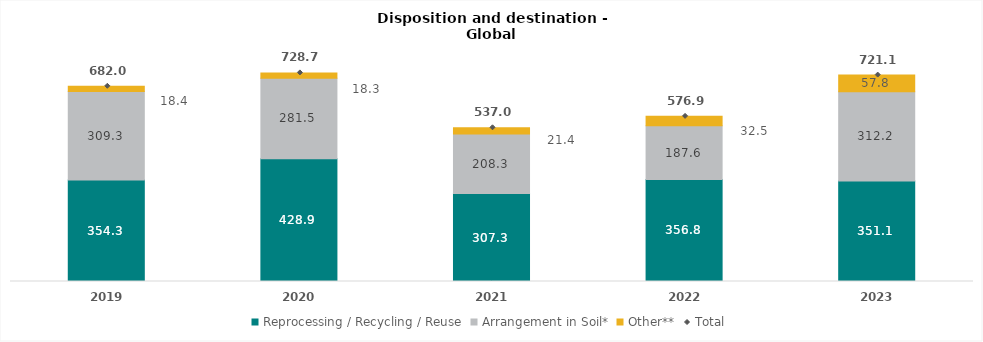
| Category | Reprocessing / Recycling / Reuse | Arrangement in Soil* | Other** |
|---|---|---|---|
| 2019.0 | 354.345 | 309.251 | 18.375 |
| 2020.0 | 428.938 | 281.482 | 18.318 |
| 2021.0 | 307.291 | 208.337 | 21.36 |
| 2022.0 | 356.75 | 187.62 | 32.54 |
| 2023.0 | 351.1 | 312.2 | 57.8 |